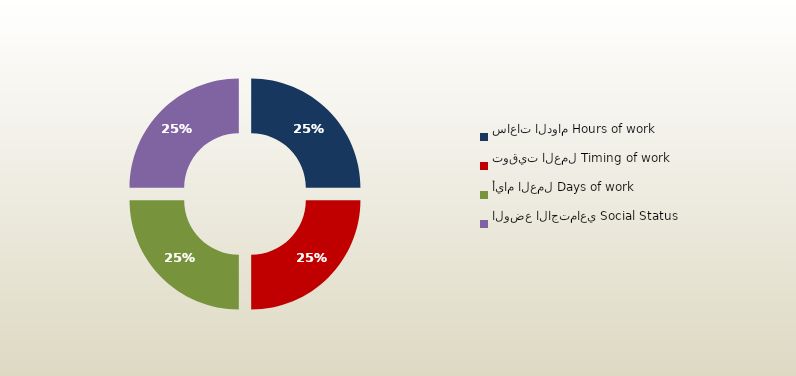
| Category | المجموع
Total |
|---|---|
| ساعات الدوام Hours of work | 59 |
| توقيت العمل Timing of work | 59 |
| أيام العمل Days of work | 59 |
| الوضع الاجتماعي Social Status | 59 |